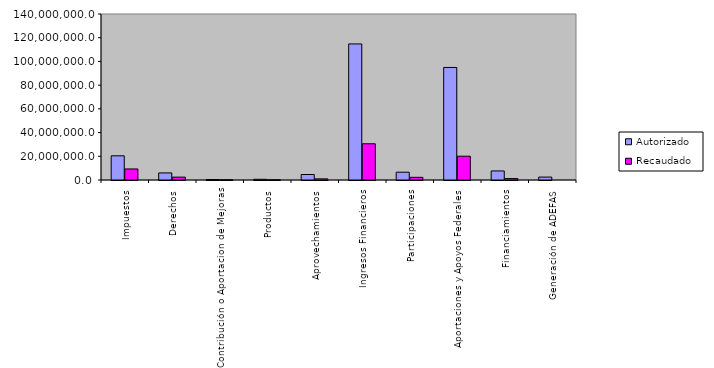
| Category | Autorizado | Recaudado |
|---|---|---|
| 0 | 20407536 | 9306955 |
| 1 | 5965480.3 | 2414215.7 |
| 2 | 421290.3 | 178384.9 |
| 3 | 591994.7 | 160749.7 |
| 4 | 4631664.6 | 951991.7 |
| 5 | 114764158.7 | 30558030.3 |
| 6 | 6584458 | 2264271.4 |
| 7 | 94908676.1 | 20063683.3 |
| 8 | 7639931.6 | 1212338 |
| 9 | 2460661.3 | 0 |